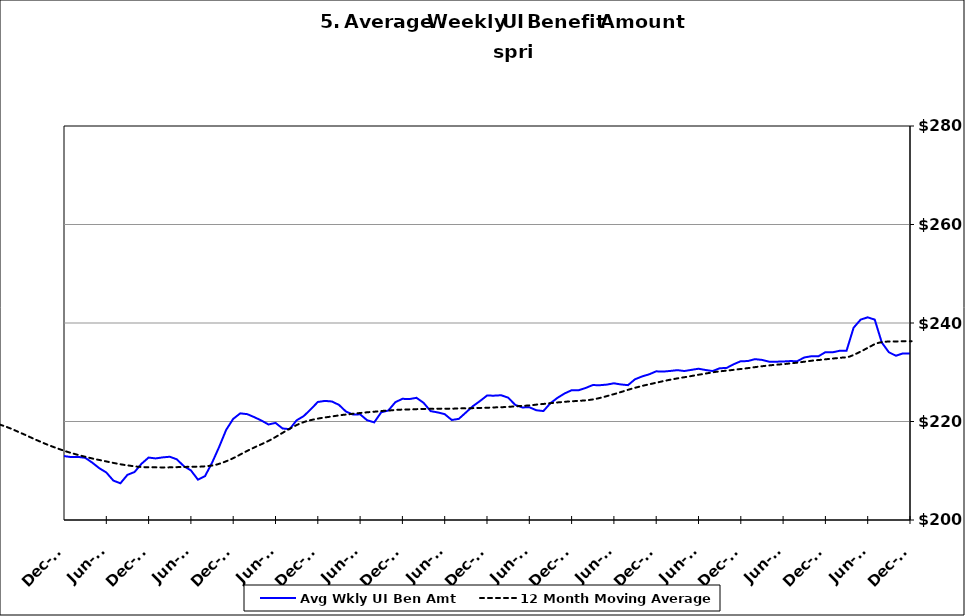
| Category | Avg Wkly UI Ben Amt |
|---|---|
| 1995-01-31 | 152.517 |
| 1995-02-28 | 151.164 |
| 1995-03-31 | 148.4 |
| 1995-04-30 | 146.034 |
| 1995-05-31 | 146.738 |
| 1995-06-30 | 147.885 |
| 1995-07-31 | 145.798 |
| 1995-08-31 | 144.052 |
| 1995-09-30 | 147.334 |
| 1995-10-31 | 151.535 |
| 1995-11-30 | 152.903 |
| 1995-12-31 | 153.258 |
| 1996-01-15 | 153.468 |
| 1996-02-15 | 153.032 |
| 1996-03-15 | 155.453 |
| 1996-04-15 | 148.614 |
| 1996-05-15 | 148.648 |
| 1996-06-15 | 150.145 |
| 1996-07-15 | 147.052 |
| 1996-08-15 | 146.042 |
| 1996-09-15 | 149.978 |
| 1996-10-15 | 151.319 |
| 1996-11-15 | 153.295 |
| 1996-12-15 | 155.775 |
| 1997-01-15 | 154.813 |
| 1997-02-15 | 151.102 |
| 1997-03-15 | 149.222 |
| 1997-04-15 | 145.178 |
| 1997-05-31 | 145.194 |
| 1997-06-30 | 146.718 |
| 1997-07-31 | 142.224 |
| 1997-08-31 | 142.382 |
| 1997-09-30 | 143.123 |
| 1997-10-31 | 146.797 |
| 1997-11-30 | 148.163 |
| 1997-12-31 | 147.967 |
| 1998-01-31 | 147.87 |
| 1998-02-28 | 147.591 |
| 1998-03-31 | 147.262 |
| 1998-04-30 | 144.746 |
| 1998-05-31 | 146.093 |
| 1998-06-30 | 147.355 |
| 1998-07-31 | 146.079 |
| 1998-08-31 | 147.387 |
| 1998-09-30 | 147.529 |
| 1998-10-31 | 152.825 |
| 1998-11-30 | 156.171 |
| 1998-12-31 | 156.424 |
| 1999-01-31 | 157.388 |
| 1999-02-28 | 157.868 |
| 1999-03-31 | 157.505 |
| 1999-04-30 | 153.987 |
| 1999-05-31 | 153.665 |
| 1999-06-30 | 153.746 |
| 1999-07-31 | 154.09 |
| 1999-08-31 | 156.162 |
| 1999-09-30 | 157.136 |
| 1999-10-31 | 162.476 |
| 1999-11-30 | 163.291 |
| 1999-12-31 | 165.621 |
| 2000-01-31 | 166.425 |
| 2000-02-29 | 165.378 |
| 2000-03-31 | 163.05 |
| 2000-04-30 | 161.908 |
| 2000-05-31 | 160.484 |
| 2000-06-30 | 160.865 |
| 2000-07-31 | 161.011 |
| 2000-08-31 | 158.845 |
| 2000-09-30 | 161.127 |
| 2000-10-31 | 163.997 |
| 2000-11-30 | 164.759 |
| 2000-12-31 | 166.66 |
| 2001-01-31 | 168.164 |
| 2001-02-28 | 169.339 |
| 2001-03-31 | 169.617 |
| 2001-04-30 | 170.349 |
| 2001-05-31 | 168.417 |
| 2001-06-30 | 169.418 |
| 2001-07-31 | 169.733 |
| 2001-08-31 | 170.578 |
| 2001-09-30 | 174.36 |
| 2001-10-31 | 176.952 |
| 2001-11-30 | 178.489 |
| 2001-12-31 | 179.805 |
| 2002-01-31 | 179.529 |
| 2002-02-28 | 179.269 |
| 2002-03-31 | 178.588 |
| 2002-04-30 | 177.594 |
| 2002-05-31 | 175.021 |
| 2002-06-30 | 175.298 |
| 2002-07-31 | 173.853 |
| 2002-08-31 | 172.776 |
| 2002-09-30 | 174.657 |
| 2002-10-31 | 175.648 |
| 2002-11-30 | 176.299 |
| 2002-12-31 | 177.239 |
| 2003-01-31 | 176.943 |
| 2003-02-28 | 176.988 |
| 2003-03-31 | 175.698 |
| 2003-04-30 | 172.857 |
| 2003-05-31 | 171.934 |
| 2003-06-30 | 171.956 |
| 2003-07-31 | 170.949 |
| 2003-08-31 | 171.311 |
| 2003-09-30 | 171.909 |
| 2003-10-31 | 172.692 |
| 2003-11-30 | 173.689 |
| 2003-12-31 | 174.176 |
| 2004-01-31 | 173.867 |
| 2004-02-29 | 173.648 |
| 2004-03-31 | 172.152 |
| 2004-04-30 | 170.705 |
| 2004-05-31 | 170.684 |
| 2004-06-30 | 170.635 |
| 2004-07-31 | 171.229 |
| 2004-08-31 | 175.375 |
| 2004-09-30 | 182.737 |
| 2004-10-31 | 187.554 |
| 2004-11-30 | 191.316 |
| 2004-12-31 | 194.602 |
| 2005-01-31 | 196.38 |
| 2005-02-28 | 196.569 |
| 2005-03-31 | 195.523 |
| 2005-04-30 | 193.655 |
| 2005-05-31 | 193.953 |
| 2005-06-30 | 192.728 |
| 2005-07-31 | 192.211 |
| 2005-08-31 | 191.133 |
| 2005-09-30 | 194.339 |
| 2005-10-31 | 196.819 |
| 2005-11-30 | 198.473 |
| 2005-12-31 | 199.545 |
| 2006-01-31 | 199.965 |
| 2006-02-28 | 200.117 |
| 2006-03-31 | 198.335 |
| 2006-04-30 | 197.258 |
| 2006-05-31 | 195.225 |
| 2006-06-30 | 195.734 |
| 2006-07-31 | 194.92 |
| 2006-08-31 | 194.282 |
| 2006-09-30 | 196.801 |
| 2006-10-31 | 199.137 |
| 2006-11-30 | 201.183 |
| 2006-12-31 | 202.121 |
| 2007-01-31 | 202.615 |
| 2007-02-28 | 202.465 |
| 2007-03-31 | 201.75 |
| 2007-04-30 | 200.344 |
| 2007-05-31 | 198.851 |
| 2007-06-30 | 198.258 |
| 2007-07-30 | 197.654 |
| 2007-08-31 | 198.405 |
| 2007-09-30 | 200.563 |
| 2007-10-31 | 201.857 |
| 2007-11-15 | 203.345 |
| 2007-12-15 09:36:00 | 219.243 |
| 2008-01-14 19:12:00 | 219.658 |
| 2008-02-14 04:48:00 | 220.121 |
| 2008-03-15 14:24:00 | 219.456 |
| 2008-04-15 | 217.672 |
| 2008-05-15 09:36:00 | 216.637 |
| 2008-06-14 19:12:00 | 216.035 |
| 2008-07-15 04:48:00 | 213.916 |
| 2008-08-14 14:24:00 | 214.008 |
| 2008-09-14 | 216.475 |
| 2008-10-14 09:36:00 | 217.836 |
| 2008-11-13 19:12:00 | 219.819 |
| 2008-12-14 04:48:00 | 221.529 |
| 2009-01-13 14:24:00 | 222.143 |
| 2009-02-13 | 222.091 |
| 2009-03-15 09:36:00 | 222.273 |
| 2009-04-14 19:12:00 | 222.011 |
| 2009-05-15 04:48:00 | 221.558 |
| 2009-06-14 14:24:00 | 220.761 |
| 2009-07-15 | 219.225 |
| 2009-08-14 09:36:00 | 218.364 |
| 2009-09-13 19:12:00 | 218.814 |
| 2009-10-14 04:48:00 | 218.744 |
| 2009-11-13 14:24:00 | 218.719 |
| 2009-12-14 | 218.779 |
| 2010-01-13 09:36:00 | 217.988 |
| 2010-02-12 19:12:00 | 217.521 |
| 2010-03-15 04:48:00 | 216.93 |
| 2010-04-14 14:24:00 | 215.638 |
| 2010-05-15 | 213.953 |
| 2010-06-14 09:36:00 | 213.326 |
| 2010-07-14 19:12:00 | 211.48 |
| 2010-08-14 04:48:00 | 210.615 |
| 2010-09-13 14:24:00 | 211.554 |
| 2010-10-14 | 211.956 |
| 2010-11-13 09:36:00 | 212.619 |
| 2010-12-13 19:12:00 | 212.979 |
| 2011-01-13 04:48:00 | 212.778 |
| 2011-02-12 14:24:00 | 212.812 |
| 2011-03-15 | 212.631 |
| 2011-04-14 09:36:00 | 211.659 |
| 2011-05-14 19:12:00 | 210.522 |
| 2011-06-14 04:48:00 | 209.652 |
| 2011-07-14 14:24:00 | 208.005 |
| 2011-08-14 | 207.451 |
| 2011-09-13 09:36:00 | 209.173 |
| 2011-10-13 19:12:00 | 209.736 |
| 2011-11-13 04:48:00 | 211.422 |
| 2011-12-13 14:24:00 | 212.679 |
| 2012-01-13 | 212.502 |
| 2012-02-12 09:36:00 | 212.715 |
| 2012-03-13 19:12:00 | 212.846 |
| 2012-04-13 04:48:00 | 212.323 |
| 2012-05-13 14:24:00 | 210.934 |
| 2012-06-13 | 210.073 |
| 2012-07-13 09:36:00 | 208.192 |
| 2012-08-12 19:12:00 | 208.902 |
| 2012-09-12 04:48:00 | 211.616 |
| 2012-10-12 14:24:00 | 214.814 |
| 2012-11-12 | 218.296 |
| 2012-12-12 09:36:00 | 220.532 |
| 2013-01-11 19:12:00 | 221.653 |
| 2013-02-11 04:48:00 | 221.49 |
| 2013-03-13 14:24:00 | 220.877 |
| 2013-04-13 | 220.198 |
| 2013-05-13 09:36:00 | 219.395 |
| 2013-06-12 19:12:00 | 219.716 |
| 2013-07-13 04:48:00 | 218.588 |
| 2013-08-12 14:24:00 | 218.444 |
| 2013-09-12 | 220.248 |
| 2013-10-12 09:36:00 | 221.094 |
| 2013-11-11 19:12:00 | 222.471 |
| 2013-12-12 04:48:00 | 223.964 |
| 2014-01-11 14:24:00 | 224.183 |
| 2014-02-11 | 224.065 |
| 2014-03-13 09:36:00 | 223.376 |
| 2014-04-12 19:12:00 | 222.017 |
| 2014-05-13 04:48:00 | 221.409 |
| 2014-06-12 14:24:00 | 221.458 |
| 2014-07-13 | 220.256 |
| 2014-08-12 09:36:00 | 219.823 |
| 2014-09-11 19:12:00 | 221.87 |
| 2014-10-12 04:48:00 | 222.223 |
| 2014-11-11 14:24:00 | 223.919 |
| 2014-12-12 | 224.606 |
| 2015-01-11 09:36:00 | 224.554 |
| 2015-02-10 19:12:00 | 224.808 |
| 2015-03-13 04:48:00 | 223.795 |
| 2015-04-12 14:24:00 | 222.11 |
| 2015-05-13 | 221.845 |
| 2015-06-12 09:36:00 | 221.492 |
| 2015-07-12 19:12:00 | 220.308 |
| 2015-08-12 04:48:00 | 220.534 |
| 2015-09-11 14:24:00 | 221.819 |
| 2015-10-12 | 223.117 |
| 2015-11-11 09:36:00 | 224.146 |
| 2015-12-11 19:12:00 | 225.264 |
| 2016-01-11 04:48:00 | 225.247 |
| 2016-02-10 14:24:00 | 225.331 |
| 2016-03-12 | 224.849 |
| 2016-04-11 09:36:00 | 223.376 |
| 2016-05-11 19:12:00 | 222.856 |
| 2016-06-11 04:48:00 | 222.895 |
| 2016-07-11 14:24:00 | 222.285 |
| 2016-08-11 | 222.119 |
| 2016-09-10 09:36:00 | 223.72 |
| 2016-10-10 19:12:00 | 224.805 |
| 2016-11-10 04:48:00 | 225.687 |
| 2016-12-10 14:24:00 | 226.349 |
| 2017-01-10 | 226.348 |
| 2017-02-09 09:36:00 | 226.816 |
| 2017-03-11 19:12:00 | 227.395 |
| 2017-04-11 04:48:00 | 227.37 |
| 2017-05-11 14:24:00 | 227.492 |
| 2017-06-11 | 227.755 |
| 2017-07-11 09:36:00 | 227.522 |
| 2017-08-10 19:12:00 | 227.382 |
| 2017-09-10 04:48:00 | 228.581 |
| 2017-10-10 14:24:00 | 229.154 |
| 2017-11-10 | 229.58 |
| 2017-12-10 09:36:00 | 230.186 |
| 2018-01-09 19:12:00 | 230.136 |
| 2018-02-09 04:48:00 | 230.265 |
| 2018-03-11 14:24:00 | 230.427 |
| 2018-04-11 | 230.25 |
| 2018-05-11 09:36:00 | 230.487 |
| 2018-06-10 19:12:00 | 230.714 |
| 2018-07-11 04:48:00 | 230.457 |
| 2018-08-10 14:24:00 | 230.244 |
| 2018-09-10 | 230.802 |
| 2018-10-10 09:36:00 | 230.887 |
| 2018-11-09 19:12:00 | 231.636 |
| 2018-12-10 04:48:00 | 232.24 |
| 2019-01-09 14:24:00 | 232.268 |
| 2019-02-09 | 232.662 |
| 2019-03-11 09:36:00 | 232.508 |
| 2019-04-10 19:12:00 | 232.152 |
| 2019-05-11 04:48:00 | 232.145 |
| 2019-06-10 14:24:00 | 232.186 |
| 2019-07-11 | 232.27 |
| 2019-08-10 09:36:00 | 232.238 |
| 2019-09-09 19:12:00 | 232.999 |
| 2019-10-10 04:48:00 | 233.25 |
| 2019-11-09 14:24:00 | 233.231 |
| 2019-12-10 | 234.074 |
| 2020-01-09 09:36:00 | 234.041 |
| 2020-02-08 19:12:00 | 234.352 |
| 2020-03-10 04:48:00 | 234.377 |
| 2020-04-09 14:24:00 | 239.041 |
| 2020-05-10 | 240.685 |
| 2020-06-09 09:36:00 | 241.153 |
| 2020-07-09 19:12:00 | 240.685 |
| 2020-08-09 04:48:00 | 236.032 |
| 2020-09-08 14:24:00 | 234.062 |
| 2020-10-09 | 233.35 |
| 2020-11-08 09:36:00 | 233.83 |
| 2020-12-08 19:12:00 | 233.83 |